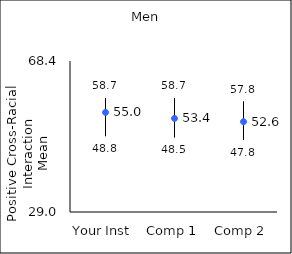
| Category | 25th percentile | 75th percentile | Mean |
|---|---|---|---|
| Your Inst | 48.8 | 58.7 | 54.99 |
| Comp 1 | 48.5 | 58.7 | 53.42 |
| Comp 2 | 47.8 | 57.8 | 52.56 |